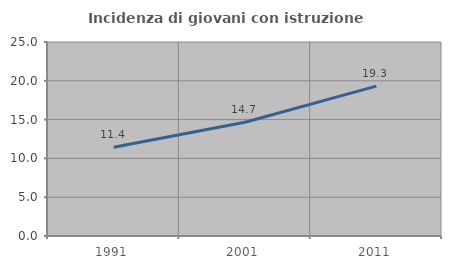
| Category | Incidenza di giovani con istruzione universitaria |
|---|---|
| 1991.0 | 11.446 |
| 2001.0 | 14.66 |
| 2011.0 | 19.31 |